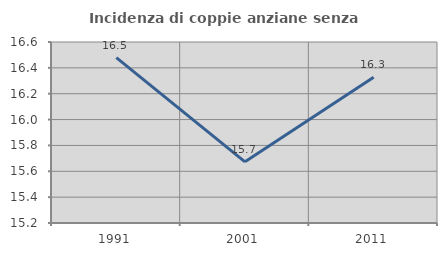
| Category | Incidenza di coppie anziane senza figli  |
|---|---|
| 1991.0 | 16.479 |
| 2001.0 | 15.673 |
| 2011.0 | 16.327 |